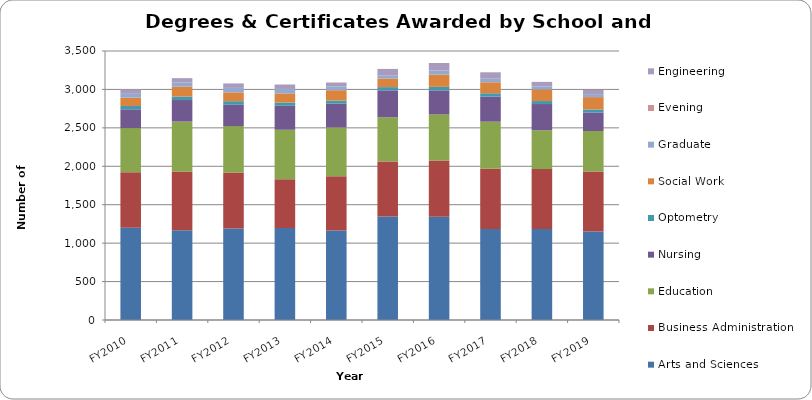
| Category | Arts and Sciences | Business Administration | Education | Nursing | Optometry | Social Work | Graduate | Evening | Engineering |
|---|---|---|---|---|---|---|---|---|---|
| FY2010 | 1201 | 720 | 576 | 244 | 43 | 109 | 50 |  | 56 |
| FY2011 | 1168 | 764 | 649 | 281 | 45 | 129 | 53 |  | 58 |
| FY2012 | 1189 | 730 | 604 | 277 | 47 | 115 | 58 |  | 58 |
| FY2013 | 1196 | 636 | 643 | 312 | 42 | 119 | 58 |  | 58 |
| FY2014 | 1163 | 708 | 634 | 309 | 40 | 136 | 49 |  | 51 |
| FY2015 | 1348 | 713 | 577 | 350 | 42 | 112 | 37 |  | 88 |
| FY2016 | 1345 | 730 | 601 | 312 | 45 | 160 | 54 |  | 97 |
| FY2017 | 1183 | 786 | 611 | 327 | 43 | 143 | 47 |  | 83 |
| FY2018 | 1185 | 779 | 505 | 341 | 39 | 151 | 39 |  | 59 |
| FY2019 | 1152 | 780 | 527 | 241 | 39 | 161 | 39 |  | 54 |